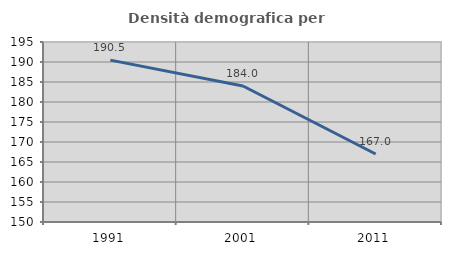
| Category | Densità demografica |
|---|---|
| 1991.0 | 190.473 |
| 2001.0 | 183.999 |
| 2011.0 | 167.006 |